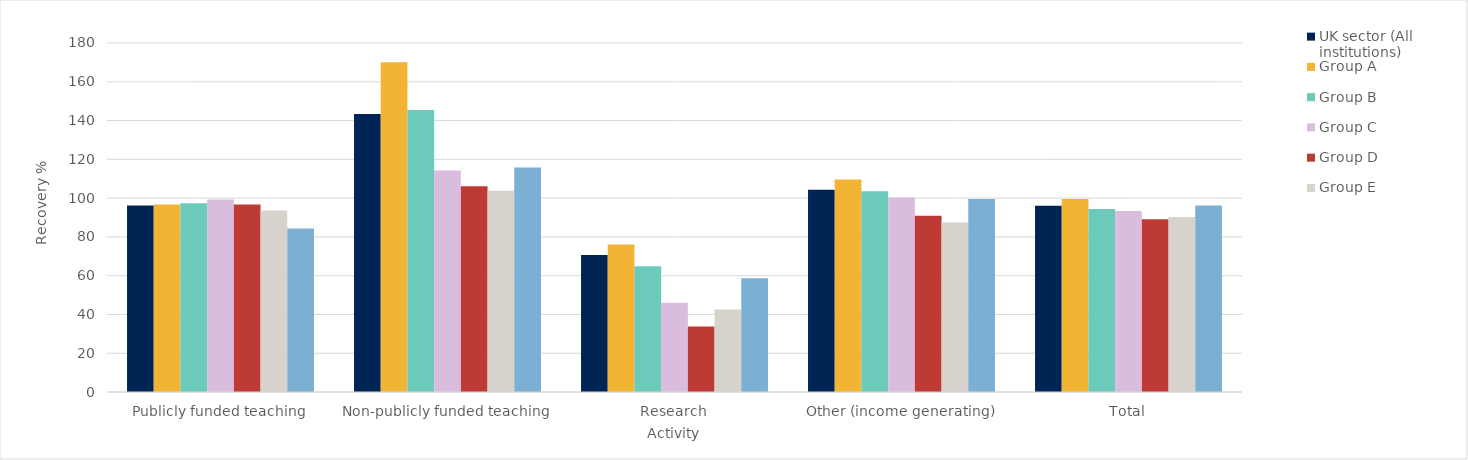
| Category | UK sector (All institutions) | Group A | Group B | Group C | Group D | Group E | Group F |
|---|---|---|---|---|---|---|---|
| 0 | 96.219 | 96.647 | 97.367 | 99.31 | 96.728 | 93.606 | 84.289 |
| 1 | 143.388 | 170.081 | 145.508 | 114.251 | 106.065 | 103.756 | 115.733 |
| 2 | 70.649 | 76.088 | 64.885 | 46.094 | 33.747 | 42.598 | 58.661 |
| 3 | 104.303 | 109.604 | 103.515 | 100.326 | 90.938 | 87.435 | 99.565 |
| 4 | 96.096 | 99.49 | 94.327 | 93.329 | 89.048 | 90.284 | 96.232 |